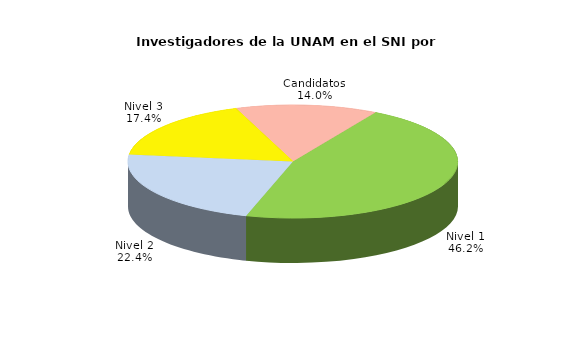
| Category | Series 0 |
|---|---|
| Nivel 1 | 2511 |
| Nivel 2 | 1217 |
| Nivel 3 | 944 |
| Candidatos | 758 |